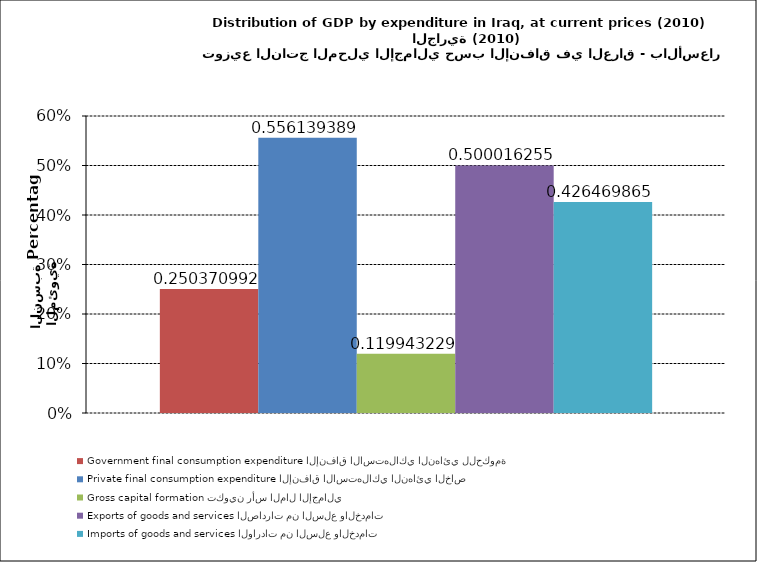
| Category | Government final consumption expenditure الإنفاق الاستهلاكي النهائي للحكومة | Private final consumption expenditure الإنفاق الاستهلاكي النهائي الخاص | Gross capital formation تكوين رأس المال الإجمالي | Exports of goods and services الصادرات من السلع والخدمات | Imports of goods and services الواردات من السلع والخدمات |
|---|---|---|---|---|---|
| 0 | 0.25 | 0.556 | 0.12 | 0.5 | 0.426 |